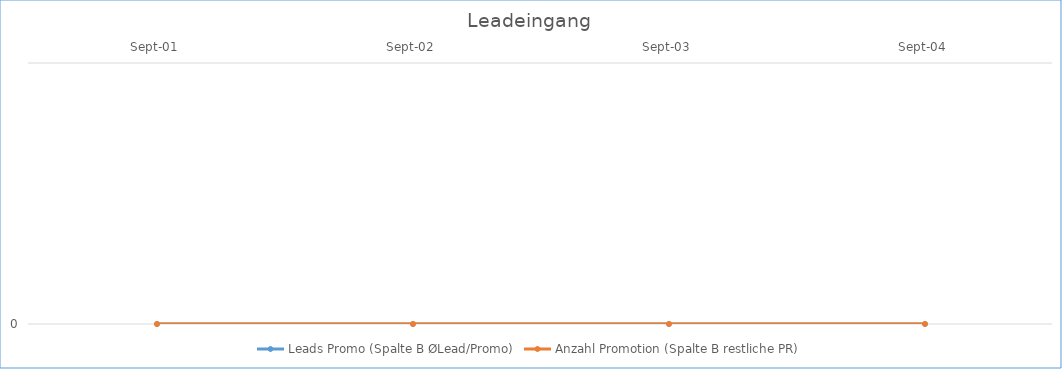
| Category | Leads Promo (Spalte B ØLead/Promo) | Anzahl Promotion (Spalte B restliche PR) |
|---|---|---|
| 2001-09-01 | 0 | 0 |
| 2002-09-01 | 0 | 0 |
| 2003-09-01 | 0 | 0 |
| 2004-09-01 | 0 | 0 |